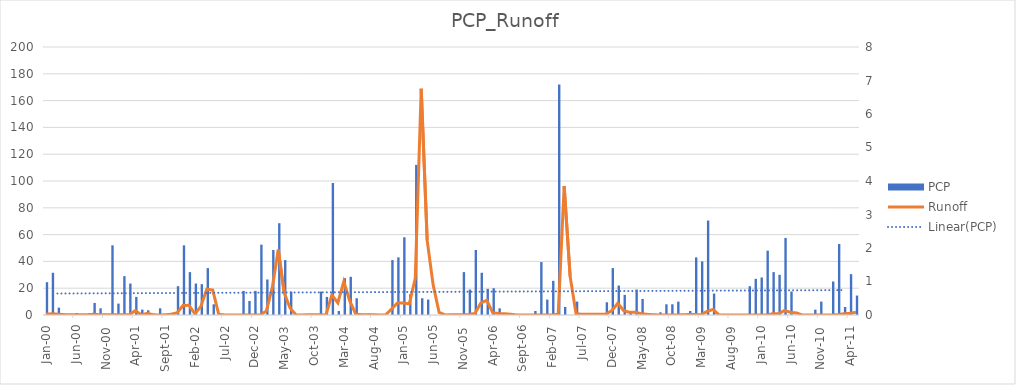
| Category | PCP |
|---|---|
| 2000-01-01 | 24.5 |
| 2000-02-01 | 31.5 |
| 2000-03-01 | 5.5 |
| 2000-04-01 | 1 |
| 2000-05-01 | 0 |
| 2000-06-01 | 1.5 |
| 2000-07-01 | 0 |
| 2000-08-01 | 0 |
| 2000-09-01 | 9 |
| 2000-10-01 | 5 |
| 2000-11-01 | 0 |
| 2000-12-01 | 52 |
| 2001-01-01 | 8.5 |
| 2001-02-01 | 29 |
| 2001-03-01 | 23.5 |
| 2001-04-01 | 13.5 |
| 2001-05-01 | 4 |
| 2001-06-01 | 3.5 |
| 2001-07-01 | 0 |
| 2001-08-01 | 5 |
| 2001-09-01 | 0 |
| 2001-10-01 | 0 |
| 2001-11-01 | 21.5 |
| 2001-12-01 | 52 |
| 2002-01-01 | 32 |
| 2002-02-01 | 23.5 |
| 2002-03-01 | 23 |
| 2002-04-01 | 35 |
| 2002-05-01 | 8 |
| 2002-06-01 | 0 |
| 2002-07-01 | 0 |
| 2002-08-01 | 0 |
| 2002-09-01 | 0 |
| 2002-10-01 | 18 |
| 2002-11-01 | 10.5 |
| 2002-12-01 | 18 |
| 2003-01-01 | 52.5 |
| 2003-02-01 | 26.5 |
| 2003-03-01 | 48.5 |
| 2003-04-01 | 68.5 |
| 2003-05-01 | 41 |
| 2003-06-01 | 17.5 |
| 2003-07-01 | 0 |
| 2003-08-01 | 0 |
| 2003-09-01 | 0 |
| 2003-10-01 | 0 |
| 2003-11-01 | 17.5 |
| 2003-12-01 | 13.5 |
| 2004-01-01 | 98.5 |
| 2004-02-01 | 3 |
| 2004-03-01 | 27.5 |
| 2004-04-01 | 28.5 |
| 2004-05-01 | 12.5 |
| 2004-06-01 | 0 |
| 2004-07-01 | 1 |
| 2004-08-01 | 0 |
| 2004-09-01 | 0 |
| 2004-10-01 | 0 |
| 2004-11-01 | 41 |
| 2004-12-01 | 43 |
| 2005-01-01 | 58 |
| 2005-02-01 | 15.5 |
| 2005-03-01 | 112 |
| 2005-04-01 | 12.5 |
| 2005-05-01 | 11.5 |
| 2005-06-01 | 0 |
| 2005-07-01 | 0 |
| 2005-08-01 | 0 |
| 2005-09-01 | 0 |
| 2005-10-01 | 0 |
| 2005-11-01 | 32 |
| 2005-12-01 | 19 |
| 2006-01-01 | 48.5 |
| 2006-02-01 | 31.5 |
| 2006-03-01 | 19.5 |
| 2006-04-01 | 20 |
| 2006-05-01 | 5 |
| 2006-06-01 | 0 |
| 2006-07-01 | 0 |
| 2006-08-01 | 0 |
| 2006-09-01 | 0 |
| 2006-10-01 | 0 |
| 2006-11-01 | 3 |
| 2006-12-01 | 39.5 |
| 2007-01-01 | 11.5 |
| 2007-02-01 | 25.5 |
| 2007-03-01 | 172 |
| 2007-04-01 | 6 |
| 2007-05-01 | 0 |
| 2007-06-01 | 10 |
| 2007-07-01 | 0 |
| 2007-08-01 | 0 |
| 2007-09-01 | 0 |
| 2007-10-01 | 0 |
| 2007-11-01 | 9.5 |
| 2007-12-01 | 35 |
| 2008-01-01 | 22 |
| 2008-02-01 | 15 |
| 2008-03-01 | 3 |
| 2008-04-01 | 19 |
| 2008-05-01 | 12 |
| 2008-06-01 | 0 |
| 2008-07-01 | 0 |
| 2008-08-01 | 2 |
| 2008-09-01 | 8 |
| 2008-10-01 | 8 |
| 2008-11-01 | 10 |
| 2008-12-01 | 0 |
| 2009-01-01 | 3 |
| 2009-02-01 | 43 |
| 2009-03-01 | 40 |
| 2009-04-01 | 70.5 |
| 2009-05-01 | 16 |
| 2009-06-01 | 0 |
| 2009-07-01 | 0 |
| 2009-08-01 | 0 |
| 2009-09-01 | 0 |
| 2009-10-01 | 0 |
| 2009-11-01 | 21.5 |
| 2009-12-01 | 27 |
| 2010-01-01 | 28 |
| 2010-02-01 | 48 |
| 2010-03-01 | 32 |
| 2010-04-01 | 30 |
| 2010-05-01 | 57.5 |
| 2010-06-01 | 17.5 |
| 2010-07-01 | 0 |
| 2010-08-01 | 0 |
| 2010-09-01 | 0 |
| 2010-10-01 | 4 |
| 2010-11-01 | 10 |
| 2010-12-01 | 0 |
| 2011-01-01 | 25 |
| 2011-02-01 | 53 |
| 2011-03-01 | 6 |
| 2011-04-01 | 30.5 |
| 2011-05-01 | 14.5 |